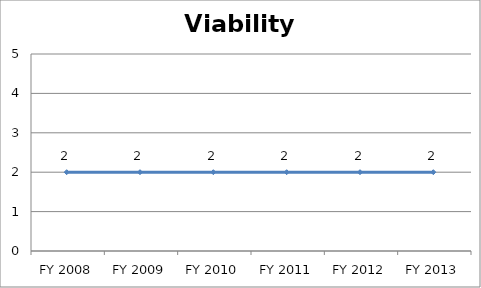
| Category | Viability score |
|---|---|
| FY 2013 | 2 |
| FY 2012 | 2 |
| FY 2011 | 2 |
| FY 2010 | 2 |
| FY 2009 | 2 |
| FY 2008 | 2 |